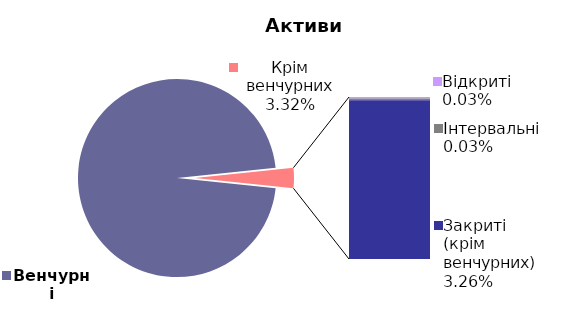
| Category | 31.03.2018 |
|---|---|
| Венчурні | 0.967 |
| Відкриті | 0 |
| Інтервальні | 0 |
| Закриті (крім венчурних) | 0.033 |